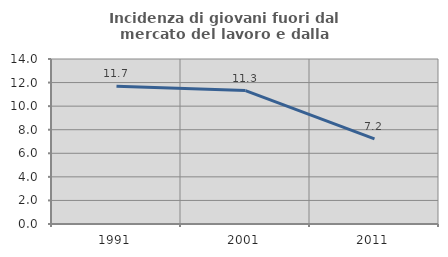
| Category | Incidenza di giovani fuori dal mercato del lavoro e dalla formazione  |
|---|---|
| 1991.0 | 11.688 |
| 2001.0 | 11.321 |
| 2011.0 | 7.229 |